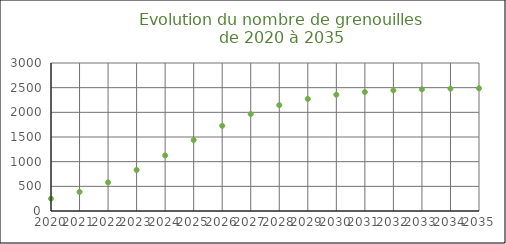
| Category | Nombre de
grenouilles P(t) |
|---|---|
| 2020.0 | 250 |
| 2021.0 | 387.07 |
| 2022.0 | 579.923 |
| 2023.0 | 831.07 |
| 2024.0 | 1127.133 |
| 2025.0 | 1437.802 |
| 2026.0 | 1726.42 |
| 2027.0 | 1965.754 |
| 2028.0 | 2146.216 |
| 2029.0 | 2272.767 |
| 2030.0 | 2357.064 |
| 2031.0 | 2411.31 |
| 2032.0 | 2445.445 |
| 2033.0 | 2466.624 |
| 2034.0 | 2479.65 |
| 2035.0 | 2487.617 |